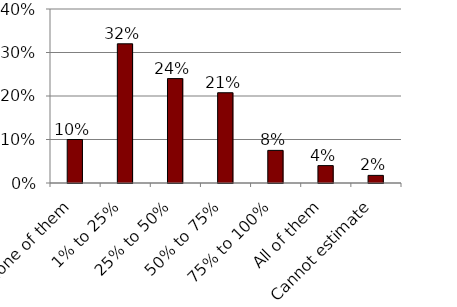
| Category | Series 0 |
|---|---|
| None of them | 0.1 |
| 1% to 25% | 0.32 |
| 25% to 50% | 0.24 |
| 50% to 75% | 0.208 |
| 75% to 100% | 0.075 |
| All of them | 0.04 |
| Cannot estimate | 0.018 |